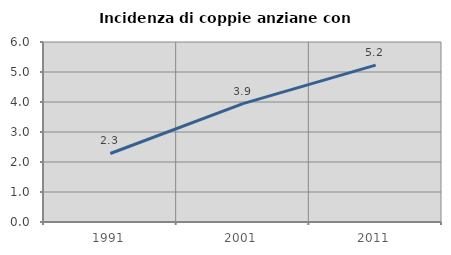
| Category | Incidenza di coppie anziane con figli |
|---|---|
| 1991.0 | 2.284 |
| 2001.0 | 3.947 |
| 2011.0 | 5.231 |